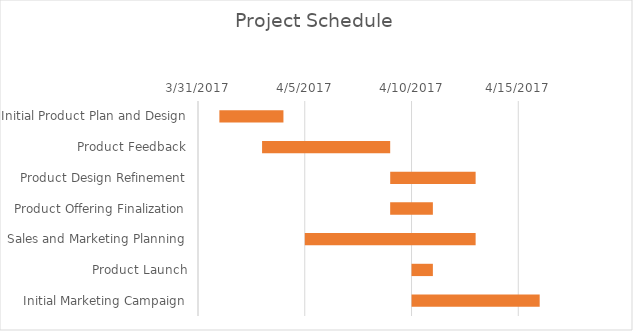
| Category | Start Date | Duration |
|---|---|---|
| Initial Product Plan and Design | 4/1/17 | 3 |
| Product Feedback | 4/3/17 | 6 |
| Product Design Refinement | 4/9/17 | 4 |
| Product Offering Finalization | 4/9/17 | 2 |
| Sales and Marketing Planning | 4/5/17 | 8 |
| Product Launch | 4/10/17 | 1 |
| Initial Marketing Campaign | 4/10/17 | 6 |